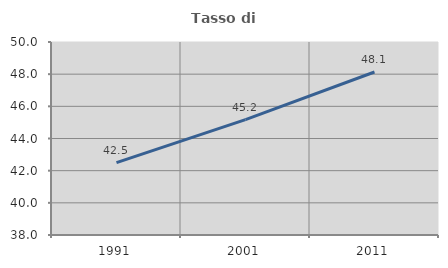
| Category | Tasso di occupazione   |
|---|---|
| 1991.0 | 42.503 |
| 2001.0 | 45.174 |
| 2011.0 | 48.134 |